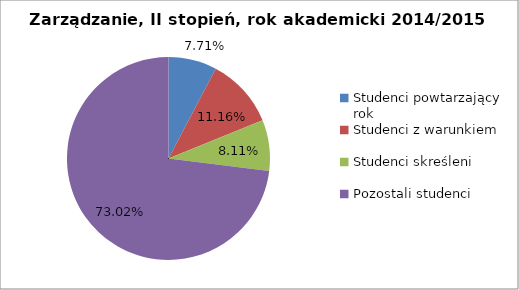
| Category | Series 0 |
|---|---|
| Studenci powtarzający rok | 38 |
| Studenci z warunkiem | 55 |
| Studenci skreśleni | 40 |
| Pozostali studenci | 360 |